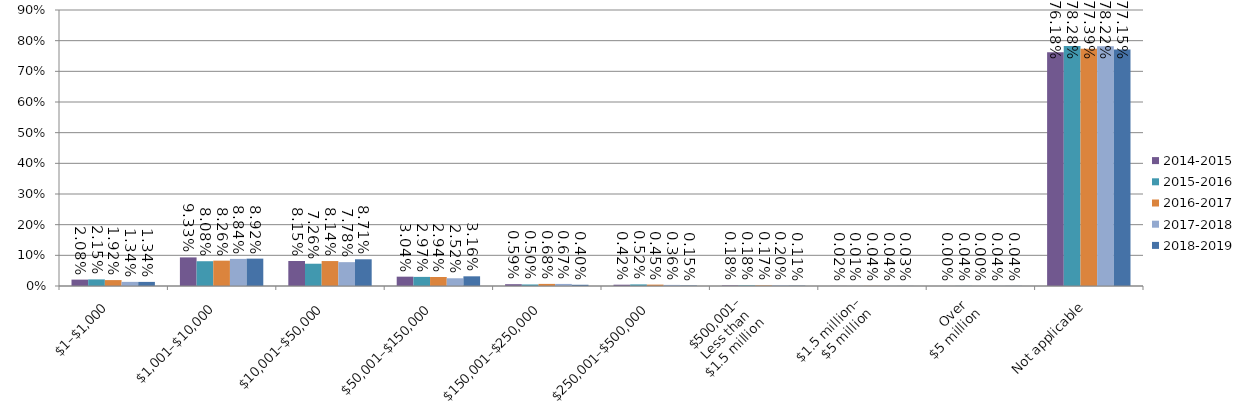
| Category | 2014-2015 | 2015-2016 | 2016-2017 | 2017-2018 | 2018-2019 |
|---|---|---|---|---|---|
| $1–$1,000 | 0.021 | 0.022 | 0.019 | 0.013 | 0.013 |
| $1,001–$10,000 | 0.093 | 0.081 | 0.083 | 0.088 | 0.089 |
| $10,001–$50,000 | 0.082 | 0.073 | 0.081 | 0.078 | 0.087 |
| $50,001–$150,000 | 0.03 | 0.03 | 0.029 | 0.025 | 0.032 |
| $150,001–$250,000 | 0.006 | 0.005 | 0.007 | 0.007 | 0.004 |
| $250,001–$500,000 | 0.004 | 0.005 | 0.005 | 0.004 | 0.001 |
| $500,001–
Less than 
$1.5 million | 0.002 | 0.002 | 0.002 | 0.002 | 0.001 |
| $1.5 million–
$5 million | 0 | 0 | 0 | 0 | 0 |
| Over 
$5 million | 0 | 0 | 0 | 0 | 0 |
| Not applicable | 0.762 | 0.783 | 0.774 | 0.782 | 0.771 |